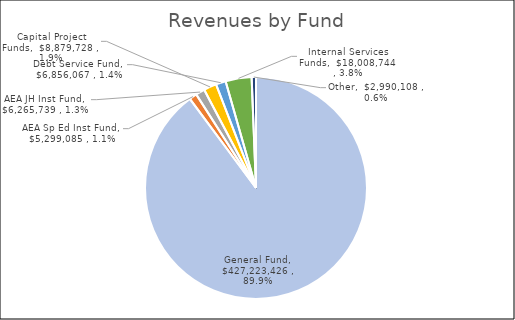
| Category | Series 0 |
|---|---|
| General Fund | 427223425.92 |
| AEA Sp Ed Inst Fund | 5299085.1 |
| AEA JH Inst Fund | 6265739.01 |
| Capital Project Funds | 8879728.29 |
| Debt Service Fund | 6856067.44 |
| Internal Services Funds | 18008744.05 |
| Other | 2990108.39 |